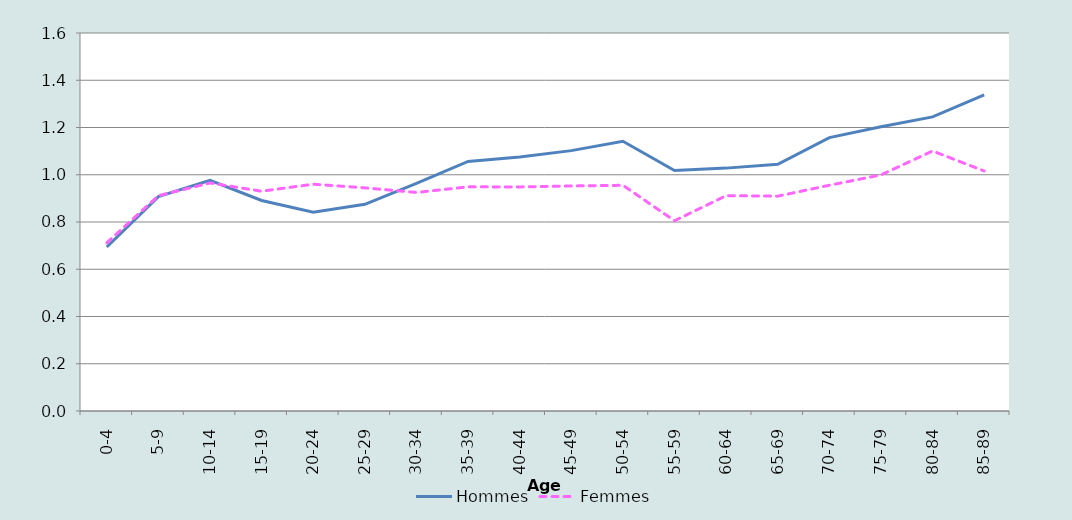
| Category | Hommes | Femmes |
|---|---|---|
| 0-4 | 0.694 | 0.712 |
| 5-9 | 0.907 | 0.911 |
| 10-14 | 0.976 | 0.965 |
| 15-19 | 0.891 | 0.93 |
| 20-24 | 0.841 | 0.96 |
| 25-29 | 0.875 | 0.945 |
| 30-34 | 0.963 | 0.925 |
| 35-39 | 1.056 | 0.949 |
| 40-44 | 1.075 | 0.948 |
| 45-49 | 1.102 | 0.953 |
| 50-54 | 1.142 | 0.955 |
| 55-59 | 1.018 | 0.805 |
| 60-64 | 1.028 | 0.911 |
| 65-69 | 1.044 | 0.909 |
| 70-74 | 1.157 | 0.955 |
| 75-79 | 1.203 | 0.999 |
| 80-84 | 1.245 | 1.101 |
| 85-89 | 1.338 | 1.016 |